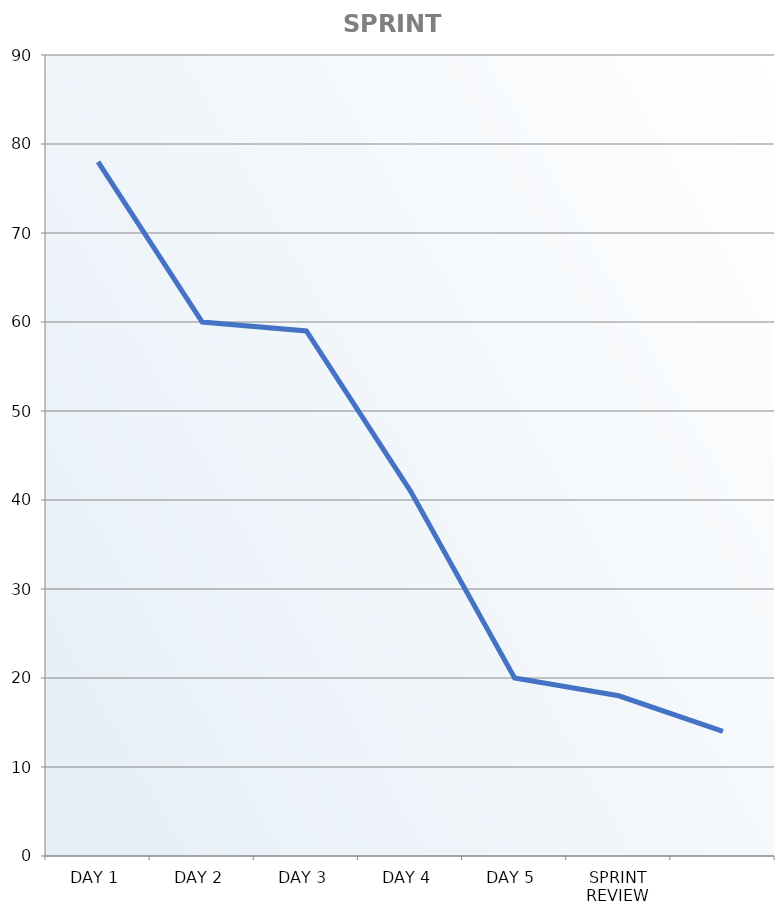
| Category | Sprint Burndown Chart |
|---|---|
| DAY 1 | 78 |
| DAY 2 | 60 |
| DAY 3 | 59 |
| DAY 4 | 41 |
| DAY 5 | 20 |
| SPRINT REVIEW | 18 |